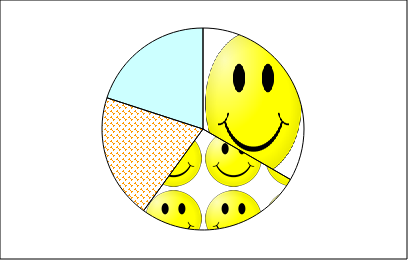
| Category | Series 1 |
|---|---|
| Point 1 | 50 |
| Point 2 | 40 |
| Point 3 | 30 |
| Point 4 | 30 |